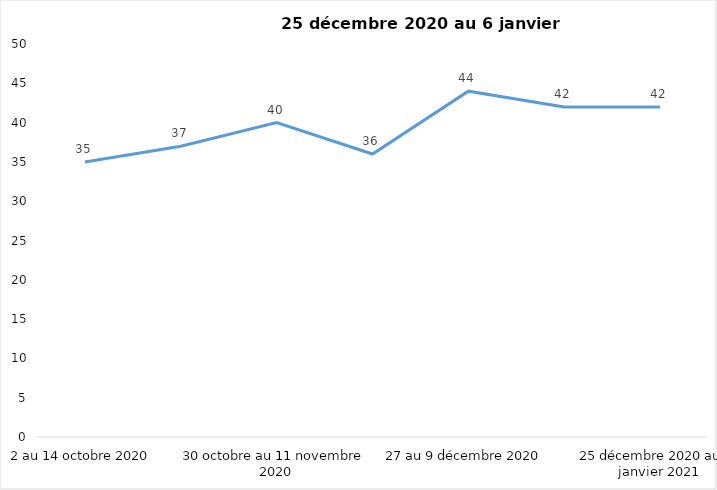
| Category | Toujours aux trois mesures |
|---|---|
| 2 au 14 octobre 2020 | 35 |
| 16 au 28 octobre 2020 | 37 |
| 30 octobre au 11 novembre 2020 | 40 |
| 13 au 25 novembre 2020 | 36 |
| 27 au 9 décembre 2020 | 44 |
| 11 au 25 décembre 2020 | 42 |
| 25 décembre 2020 au 6 janvier 2021 | 42 |